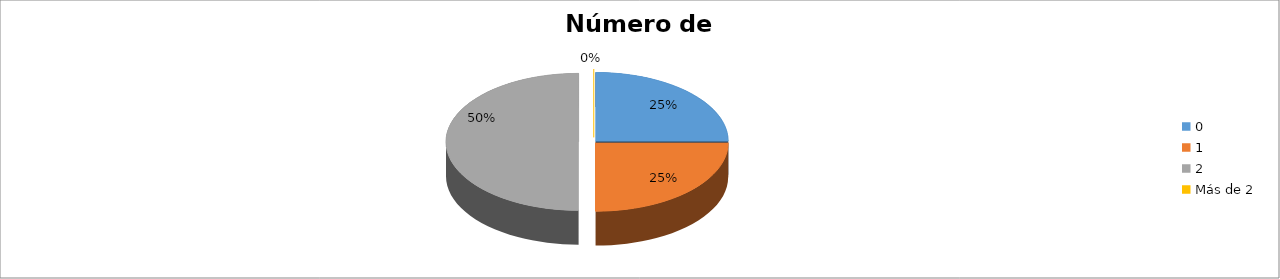
| Category | Series 0 |
|---|---|
| 0 | 0.25 |
| 1 | 0.25 |
| 2 | 0.5 |
| Más de 2 | 0 |